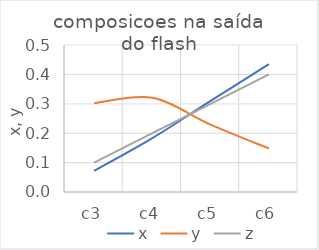
| Category |  x  |  y  | z |
|---|---|---|---|
| c3 | 0.072 | 0.302 | 0.1 |
| c4 | 0.183 | 0.321 | 0.2 |
| c5 | 0.31 | 0.229 | 0.3 |
| c6 | 0.435 | 0.148 | 0.4 |